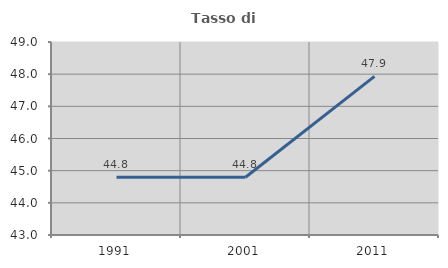
| Category | Tasso di occupazione   |
|---|---|
| 1991.0 | 44.798 |
| 2001.0 | 44.797 |
| 2011.0 | 47.931 |